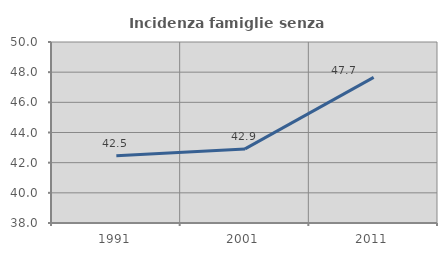
| Category | Incidenza famiglie senza nuclei |
|---|---|
| 1991.0 | 42.466 |
| 2001.0 | 42.91 |
| 2011.0 | 47.653 |